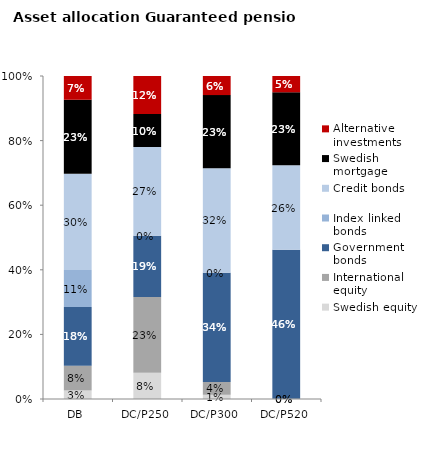
| Category | Swedish equity | International equity | Government bonds | Index linked bonds | Credit bonds | Swedish mortgage | Alternative investments |
|---|---|---|---|---|---|---|---|
| DB | 0.027 | 0.077 | 0.182 | 0.114 | 0.298 | 0.229 | 0.074 |
| DC/P250 | 0.081 | 0.235 | 0.189 | 0 | 0.275 | 0.103 | 0.117 |
| DC/P300 | 0.013 | 0.04 | 0.338 | 0 | 0.324 | 0.226 | 0.059 |
| DC/P520 | 0 | 0 | 0.461 | 0 | 0.262 | 0.226 | 0.05 |